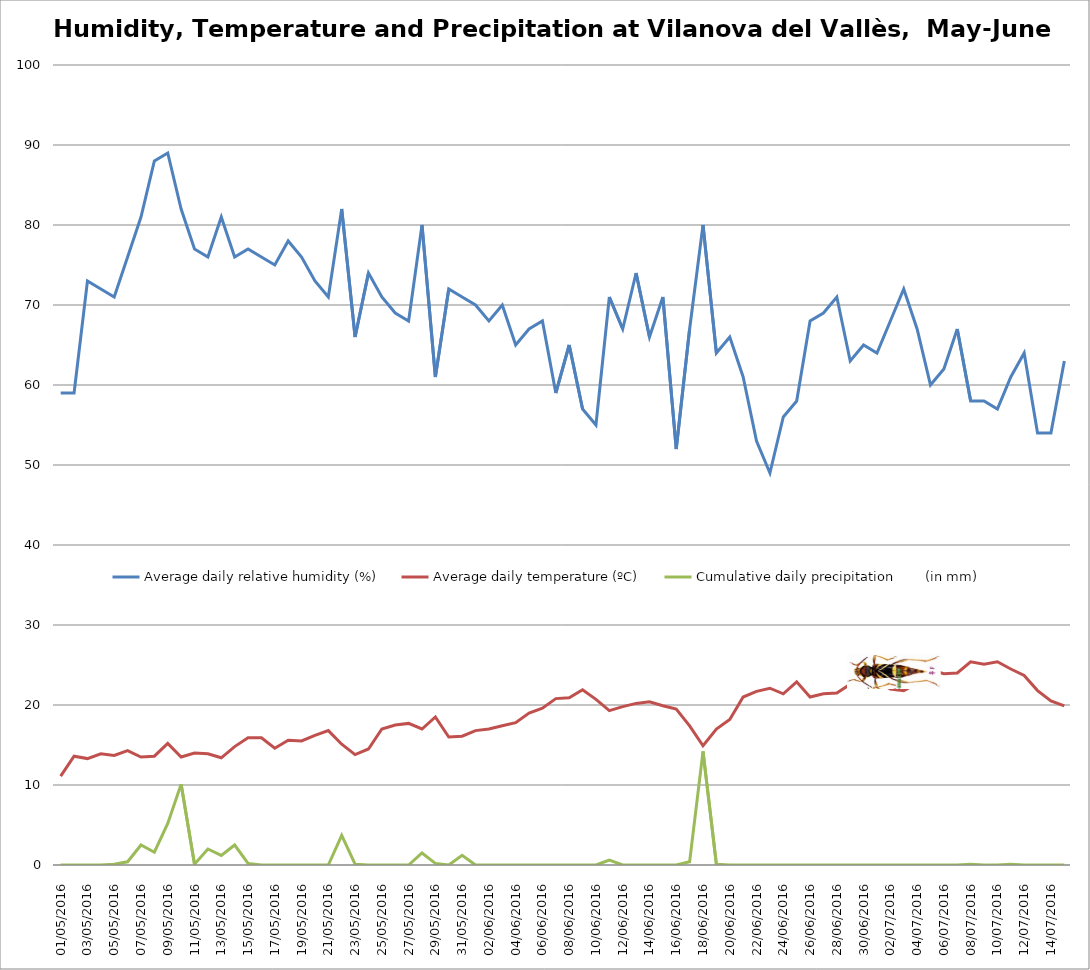
| Category | Average daily relative humidity (%) | Average daily temperature (ºC) | Cumulative daily precipitation        (in mm) |
|---|---|---|---|
| 01/05/2016 | 59 | 11.1 | 0 |
| 02/05/2016 | 59 | 13.6 | 0 |
| 03/05/2016 | 73 | 13.3 | 0 |
| 04/05/2016 | 72 | 13.9 | 0 |
| 05/05/2016 | 71 | 13.7 | 0.1 |
| 06/05/2016 | 76 | 14.3 | 0.4 |
| 07/05/2016 | 81 | 13.5 | 2.5 |
| 08/05/2016 | 88 | 13.6 | 1.6 |
| 09/05/2016 | 89 | 15.2 | 5.2 |
| 10/05/2016 | 82 | 13.5 | 10.1 |
| 11/05/2016 | 77 | 14 | 0.1 |
| 12/05/2016 | 76 | 13.9 | 2 |
| 13/05/2016 | 81 | 13.4 | 1.2 |
| 14/05/2016 | 76 | 14.8 | 2.5 |
| 15/05/2016 | 77 | 15.9 | 0.2 |
| 16/05/2016 | 76 | 15.9 | 0 |
| 17/05/2016 | 75 | 14.6 | 0 |
| 18/05/2016 | 78 | 15.6 | 0 |
| 19/05/2016 | 76 | 15.5 | 0 |
| 20/05/2016 | 73 | 16.2 | 0 |
| 21/05/2016 | 71 | 16.8 | 0 |
| 22/05/2016 | 82 | 15.1 | 3.7 |
| 23/05/2016 | 66 | 13.8 | 0.1 |
| 24/05/2016 | 74 | 14.5 | 0 |
| 25/05/2016 | 71 | 17 | 0 |
| 26/05/2016 | 69 | 17.5 | 0 |
| 27/05/2016 | 68 | 17.7 | 0 |
| 28/05/2016 | 80 | 17 | 1.5 |
| 29/05/2016 | 61 | 18.5 | 0.2 |
| 30/05/2016 | 72 | 16 | 0 |
| 31/05/2016 | 71 | 16.1 | 1.2 |
| 01/06/2016 | 70 | 16.8 | 0 |
| 02/06/2016 | 68 | 17 | 0 |
| 03/06/2016 | 70 | 17.4 | 0 |
| 04/06/2016 | 65 | 17.8 | 0 |
| 05/06/2016 | 67 | 19 | 0 |
| 06/06/2016 | 68 | 19.6 | 0 |
| 07/06/2016 | 59 | 20.8 | 0 |
| 08/06/2016 | 65 | 20.9 | 0 |
| 09/06/2016 | 57 | 21.9 | 0 |
| 10/06/2016 | 55 | 20.7 | 0 |
| 11/06/2016 | 71 | 19.3 | 0.6 |
| 12/06/2016 | 67 | 19.8 | 0 |
| 13/06/2016 | 74 | 20.2 | 0 |
| 14/06/2016 | 66 | 20.4 | 0 |
| 15/06/2016 | 71 | 19.9 | 0 |
| 16/06/2016 | 52 | 19.5 | 0 |
| 17/06/2016 | 67 | 17.4 | 0.4 |
| 18/06/2016 | 80 | 14.9 | 14.2 |
| 19/06/2016 | 64 | 17 | 0.1 |
| 20/06/2016 | 66 | 18.2 | 0 |
| 21/06/2016 | 61 | 21 | 0 |
| 22/06/2016 | 53 | 21.7 | 0 |
| 23/06/2016 | 49 | 22.1 | 0 |
| 24/06/2016 | 56 | 21.4 | 0 |
| 25/06/2016 | 58 | 22.9 | 0 |
| 26/06/2016 | 68 | 21 | 0 |
| 27/06/2016 | 69 | 21.4 | 0 |
| 28/06/2016 | 71 | 21.5 | 0 |
| 29/06/2016 | 63 | 22.6 | 0 |
| 30/06/2016 | 65 | 22.8 | 0 |
| 01/07/2016 | 64 | 23.1 | 0 |
| 02/07/2016 | 68 | 22 | 0 |
| 03/07/2016 | 72 | 21.8 | 0 |
| 04/07/2016 | 67 | 22.7 | 0 |
| 05/07/2016 | 60 | 24.4 | 0 |
| 06/07/2016 | 62 | 23.9 | 0 |
| 07/07/2016 | 67 | 24 | 0 |
| 08/07/2016 | 58 | 25.4 | 0.1 |
| 09/07/2016 | 58 | 25.1 | 0 |
| 10/07/2016 | 57 | 25.4 | 0 |
| 11/07/2016 | 61 | 24.5 | 0.1 |
| 12/07/2016 | 64 | 23.7 | 0 |
| 13/07/2016 | 54 | 21.8 | 0 |
| 14/07/2016 | 54 | 20.5 | 0 |
| 15/07/2016 | 63 | 19.9 | 0 |